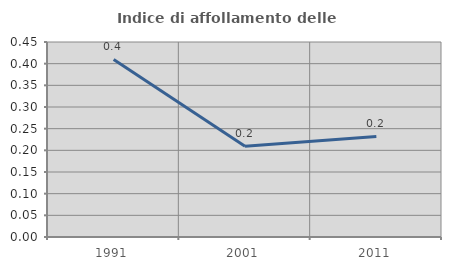
| Category | Indice di affollamento delle abitazioni  |
|---|---|
| 1991.0 | 0.41 |
| 2001.0 | 0.21 |
| 2011.0 | 0.232 |